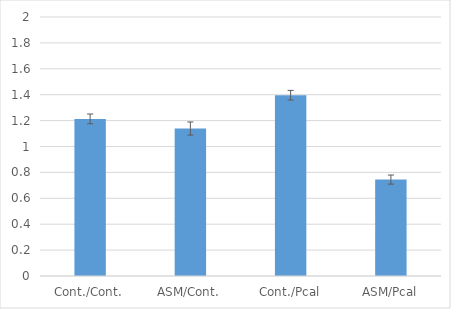
| Category | Series 0 |
|---|---|
| Cont./Cont. | 1.213 |
| ASM/Cont. | 1.139 |
| Cont./Pcal | 1.396 |
| ASM/Pcal | 0.745 |